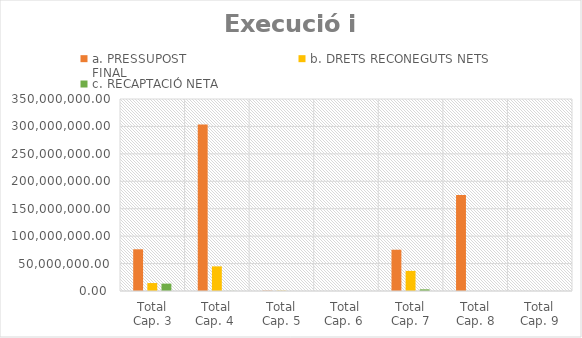
| Category | a. PRESSUPOST 
FINAL | b. DRETS RECONEGUTS NETS | c. RECAPTACIÓ NETA
 |
|---|---|---|---|
| Total Cap. 3 | 76047240.38 | 14478524.07 | 13449262.26 |
| Total Cap. 4  | 303325077.29 | 44879180.82 | 163888.81 |
| Total Cap. 5 | 594762.23 | 472032.02 | 40241.34 |
| Total Cap. 6  | 0 | 0 | 0 |
| Total Cap. 7 | 75226706.07 | 36639687.52 | 3019796.8 |
| Total Cap. 8 | 174966842.83 | 0 | 0 |
| Total Cap. 9 | 0 | 0 | 0 |